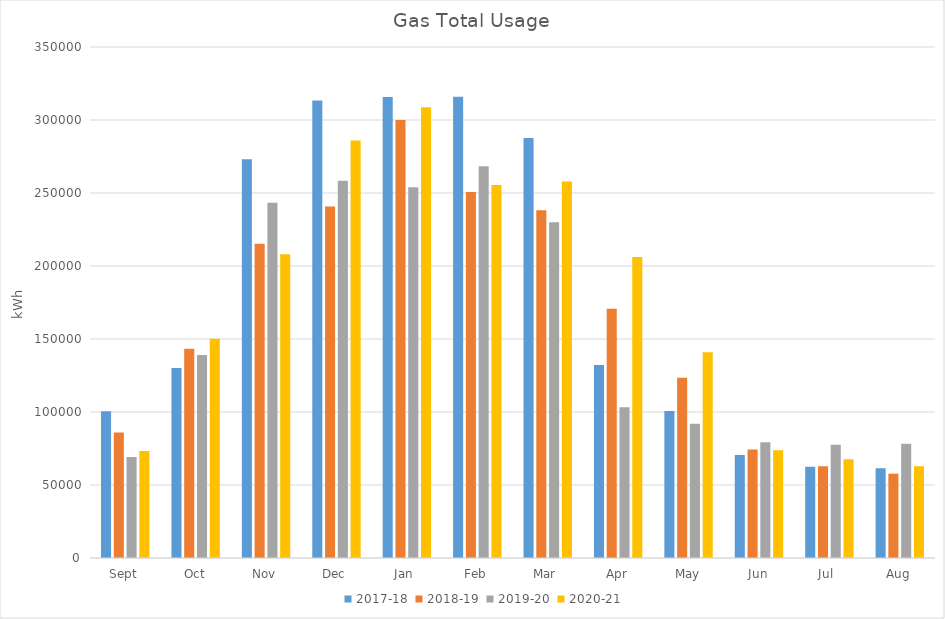
| Category | 2017-18 | 2018-19 | 2019-20 | 2020-21 |
|---|---|---|---|---|
| Sept | 100583 | 85965 | 69109 | 73336 |
| Oct | 130182 | 143238 | 139072 | 150173 |
| Nov | 273091 | 215318 | 243340 | 208070 |
| Dec | 313368 | 240751 | 258362 | 285963 |
| Jan  | 315733 | 299993 | 253869 | 308732 |
| Feb | 315844 | 250638 | 268318 | 255558 |
| Mar  | 287666 | 238148 | 229930 | 257912 |
| Apr | 132212 | 170768 | 103313 | 206212 |
| May | 100770 | 123414 | 91983 | 140970 |
| Jun | 70612 | 74260 | 79240 | 73881 |
| Jul  | 62483 | 62762 | 77614 | 67614 |
| Aug | 61556 | 57759 | 78184 | 62847 |